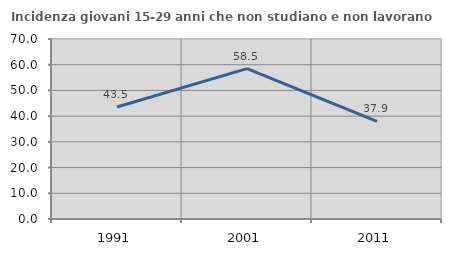
| Category | Incidenza giovani 15-29 anni che non studiano e non lavorano  |
|---|---|
| 1991.0 | 43.534 |
| 2001.0 | 58.501 |
| 2011.0 | 37.934 |